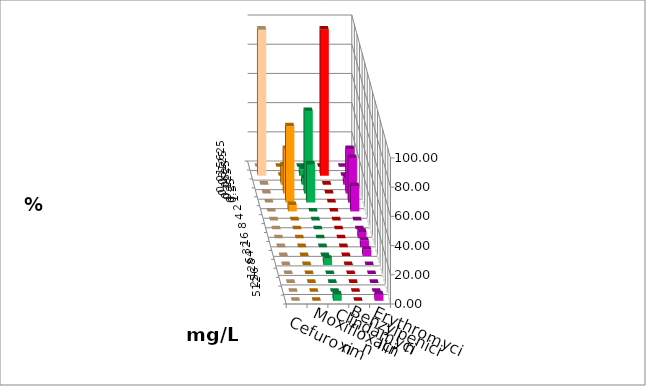
| Category | Cefuroxim | Moxifloxacin | Clindamycin | Benzylpenicillin | Erythromycin |
|---|---|---|---|---|---|
| 0.015625 | 0 | 0 | 0 | 0 | 0 |
| 0.03125 | 100 | 0 | 4.348 | 100 | 0 |
| 0.0625 | 0 | 13.043 | 4.348 | 0 | 4.348 |
| 0.125 | 0 | 30.435 | 56.522 | 0 | 30.435 |
| 0.25 | 0 | 52.174 | 26.087 | 0 | 30.435 |
| 0.5 | 0 | 4.348 | 0 | 0 | 17.391 |
| 1.0 | 0 | 0 | 0 | 0 | 0 |
| 2.0 | 0 | 0 | 0 | 0 | 0 |
| 4.0 | 0 | 0 | 0 | 0 | 4.348 |
| 8.0 | 0 | 0 | 0 | 0 | 4.348 |
| 16.0 | 0 | 0 | 0 | 0 | 4.348 |
| 32.0 | 0 | 0 | 4.348 | 0 | 0 |
| 64.0 | 0 | 0 | 0 | 0 | 0 |
| 128.0 | 0 | 0 | 0 | 0 | 0 |
| 256.0 | 0 | 0 | 0 | 0 | 0 |
| 512.0 | 0 | 0 | 4.348 | 0 | 4.348 |